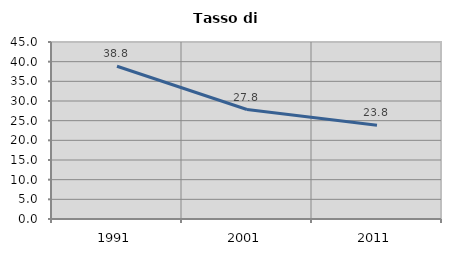
| Category | Tasso di disoccupazione   |
|---|---|
| 1991.0 | 38.836 |
| 2001.0 | 27.828 |
| 2011.0 | 23.821 |